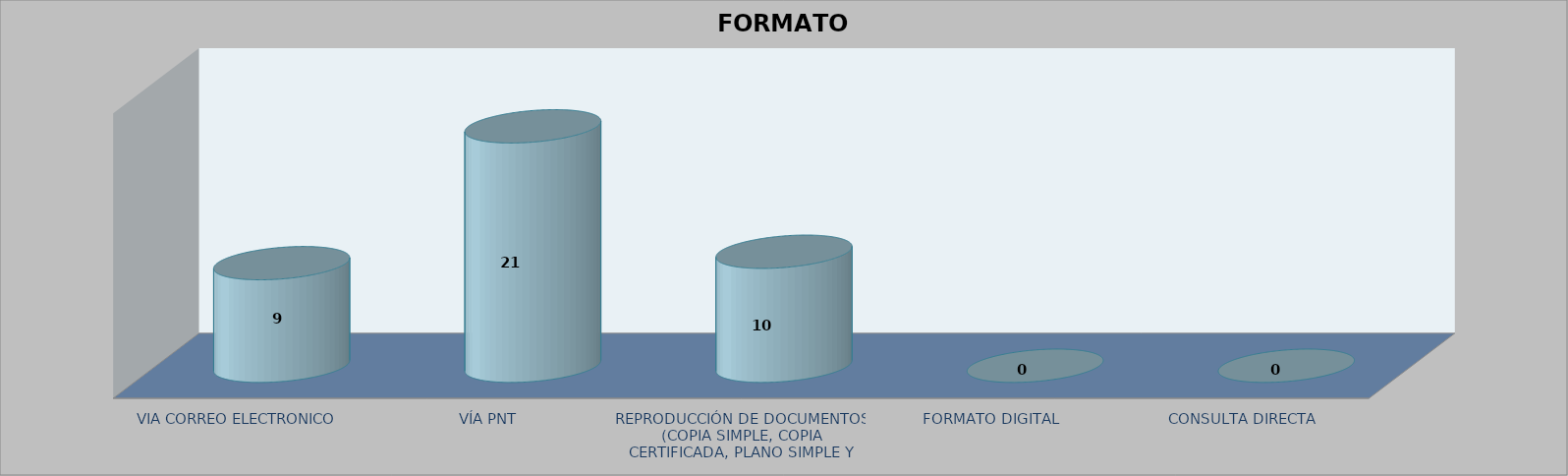
| Category |        FORMATO SOLICITADO | Series 1 | Series 2 |
|---|---|---|---|
| VIA CORREO ELECTRONICO |  |  | 9 |
| VÍA PNT |  |  | 21 |
| REPRODUCCIÓN DE DOCUMENTOS (COPIA SIMPLE, COPIA CERTIFICADA, PLANO SIMPLE Y PLANO CERTIFICADO) |  |  | 10 |
| FORMATO DIGITAL |  |  | 0 |
| CONSULTA DIRECTA |  |  | 0 |